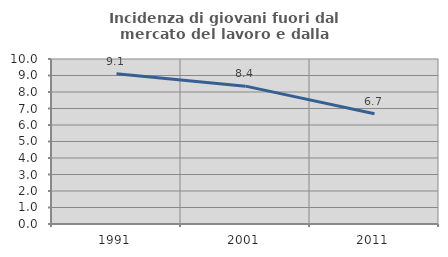
| Category | Incidenza di giovani fuori dal mercato del lavoro e dalla formazione  |
|---|---|
| 1991.0 | 9.112 |
| 2001.0 | 8.355 |
| 2011.0 | 6.685 |